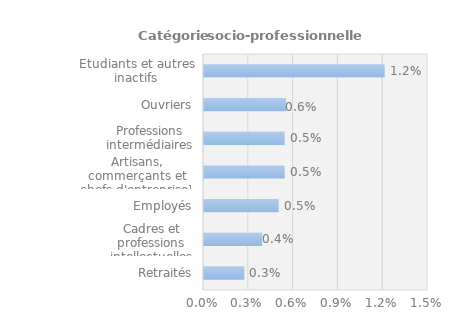
| Category | Series 0 |
|---|---|
| Retraités | 0.003 |
| Cadres et professions intellectuelles supérieures | 0.004 |
| Employés | 0.005 |
| Artisans, commerçants et chefs d'entreprise¹ | 0.005 |
| Professions intermédiaires | 0.005 |
| Ouvriers | 0.006 |
| Etudiants et autres inactifs | 0.012 |